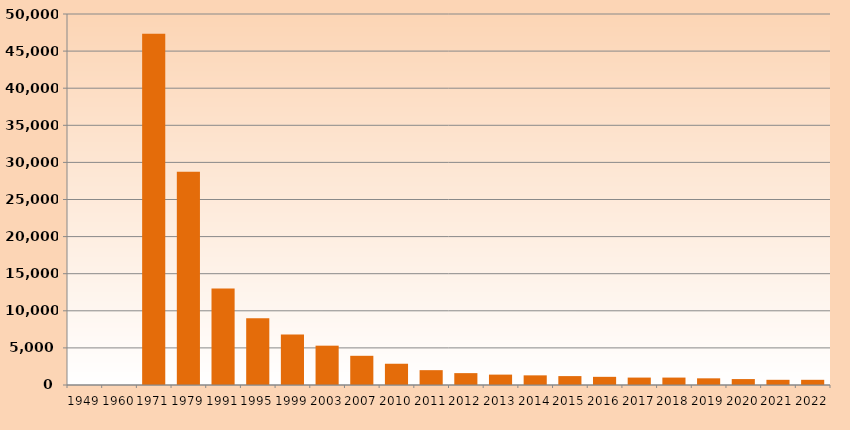
| Category | Series 1 |
|---|---|
| 1949.0 | 0 |
| 1960.0 | 0 |
| 1971.0 | 47351 |
| 1979.0 | 28724 |
| 1991.0 | 13000 |
| 1995.0 | 9000 |
| 1999.0 | 6800 |
| 2003.0 | 5300 |
| 2007.0 | 3935 |
| 2010.0 | 2865 |
| 2011.0 | 2000 |
| 2012.0 | 1600 |
| 2013.0 | 1400 |
| 2014.0 | 1300 |
| 2015.0 | 1200 |
| 2016.0 | 1100 |
| 2017.0 | 1000 |
| 2018.0 | 1000 |
| 2019.0 | 900 |
| 2020.0 | 800 |
| 2021.0 | 700 |
| 2022.0 | 700 |